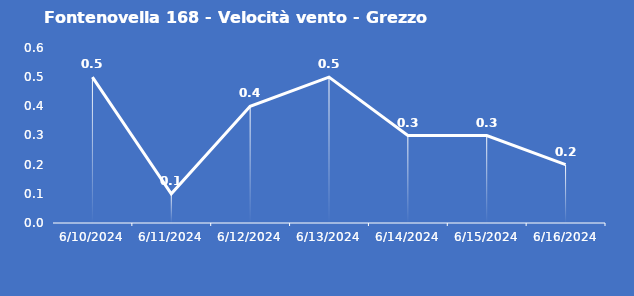
| Category | Fontenovella 168 - Velocità vento - Grezzo (m/s) |
|---|---|
| 6/10/24 | 0.5 |
| 6/11/24 | 0.1 |
| 6/12/24 | 0.4 |
| 6/13/24 | 0.5 |
| 6/14/24 | 0.3 |
| 6/15/24 | 0.3 |
| 6/16/24 | 0.2 |